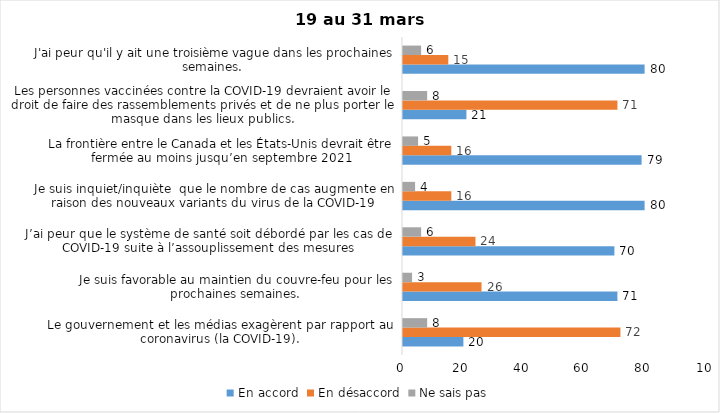
| Category | En accord | En désaccord | Ne sais pas |
|---|---|---|---|
| Le gouvernement et les médias exagèrent par rapport au coronavirus (la COVID-19). | 20 | 72 | 8 |
| Je suis favorable au maintien du couvre-feu pour les prochaines semaines. | 71 | 26 | 3 |
| J’ai peur que le système de santé soit débordé par les cas de COVID-19 suite à l’assouplissement des mesures | 70 | 24 | 6 |
| Je suis inquiet/inquiète  que le nombre de cas augmente en raison des nouveaux variants du virus de la COVID-19 | 80 | 16 | 4 |
| La frontière entre le Canada et les États-Unis devrait être fermée au moins jusqu’en septembre 2021 | 79 | 16 | 5 |
| Les personnes vaccinées contre la COVID-19 devraient avoir le droit de faire des rassemblements privés et de ne plus porter le masque dans les lieux publics. | 21 | 71 | 8 |
| J'ai peur qu'il y ait une troisième vague dans les prochaines semaines. | 80 | 15 | 6 |